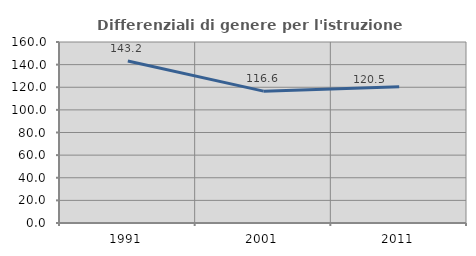
| Category | Differenziali di genere per l'istruzione superiore |
|---|---|
| 1991.0 | 143.185 |
| 2001.0 | 116.561 |
| 2011.0 | 120.546 |